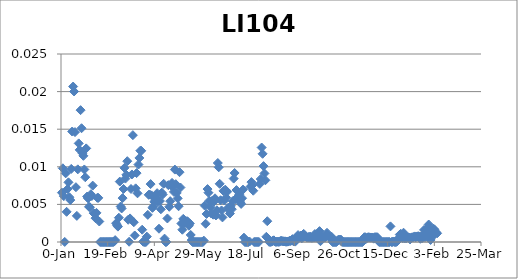
| Category |  LI104  |
|---|---|
| 0 | 0.007 |
| 1 | 0.01 |
| 2 | 0.006 |
| 3 | 0 |
| 4 | 0.009 |
| 5 | 0.004 |
| 6 | 0.007 |
| 7 | 0.008 |
| 8 | 0.006 |
| 9 | 0.006 |
| 10 | 0.01 |
| 11 | 0.015 |
| 12 | 0.021 |
| 13 | 0.02 |
| 14 | 0.015 |
| 15 | 0.007 |
| 16 | 0.003 |
| 17 | 0.01 |
| 18 | 0.013 |
| 19 | 0.012 |
| 20 | 0.018 |
| 21 | 0.015 |
| 22 | 0.012 |
| 23 | 0.011 |
| 24 | 0.01 |
| 25 | 0.009 |
| 26 | 0.012 |
| 27 | 0.006 |
| 28 | 0.006 |
| 29 | 0.005 |
| 30 | 0.005 |
| 31 | 0.006 |
| 32 | 0.006 |
| 33 | 0.007 |
| 34 | 0.004 |
| 35 | 0.004 |
| 36 | 0.003 |
| 37 | 0.004 |
| 38 | 0.006 |
| 39 | 0.006 |
| 40 | 0.003 |
| 41 | 0 |
| 42 | 0 |
| 43 | 0 |
| 44 | 0 |
| 45 | 0 |
| 46 | 0 |
| 47 | 0 |
| 48 | 0 |
| 49 | 0 |
| 50 | 0 |
| 51 | 0 |
| 52 | 0 |
| 53 | 0 |
| 54 | 0 |
| 55 | 0 |
| 56 | 0 |
| 57 | 0 |
| 58 | 0.002 |
| 59 | 0.002 |
| 60 | 0.002 |
| 61 | 0.003 |
| 62 | 0.008 |
| 63 | 0.005 |
| 64 | 0.004 |
| 65 | 0.006 |
| 66 | 0.007 |
| 67 | 0.01 |
| 68 | 0.008 |
| 69 | 0.009 |
| 70 | 0.011 |
| 71 | 0.003 |
| 72 | 0 |
| 73 | 0.003 |
| 74 | 0.007 |
| 75 | 0.009 |
| 76 | 0.014 |
| 77 | 0.003 |
| 78 | 0.001 |
| 79 | 0.007 |
| 80 | 0.009 |
| 81 | 0.006 |
| 82 | 0.01 |
| 83 | 0.011 |
| 84 | 0.012 |
| 85 | 0.012 |
| 86 | 0.002 |
| 87 | 0 |
| 88 | 0 |
| 89 | 0 |
| 90 | 0 |
| 91 | 0.001 |
| 92 | 0.004 |
| 93 | 0.006 |
| 94 | 0.006 |
| 95 | 0.008 |
| 96 | 0.006 |
| 97 | 0.005 |
| 98 | 0.005 |
| 99 | 0.005 |
| 100 | 0.006 |
| 101 | 0.006 |
| 102 | 0.006 |
| 103 | 0.005 |
| 104 | 0.002 |
| 105 | 0.005 |
| 106 | 0.004 |
| 107 | 0.007 |
| 108 | 0.006 |
| 109 | 0.008 |
| 110 | 0 |
| 111 | 0 |
| 112 | 0 |
| 113 | 0.003 |
| 114 | 0.008 |
| 115 | 0.005 |
| 116 | 0.005 |
| 117 | 0.007 |
| 118 | 0.008 |
| 119 | 0.007 |
| 120 | 0.007 |
| 121 | 0.01 |
| 122 | 0.008 |
| 123 | 0.007 |
| 124 | 0.006 |
| 125 | 0.005 |
| 126 | 0.009 |
| 127 | 0.007 |
| 128 | 0.002 |
| 129 | 0.002 |
| 130 | 0.003 |
| 131 | 0.003 |
| 132 | 0.003 |
| 133 | 0.003 |
| 134 | 0.003 |
| 135 | 0.003 |
| 136 | 0.002 |
| 137 | 0.002 |
| 138 | 0.001 |
| 139 | 0 |
| 140 | 0 |
| 141 | 0 |
| 142 | 0 |
| 143 | 0 |
| 144 | 0 |
| 145 | 0 |
| 146 | 0 |
| 147 | 0 |
| 148 | 0 |
| 149 | 0 |
| 150 | 0 |
| 151 | 0 |
| 152 | 0 |
| 153 | 0.005 |
| 154 | 0.002 |
| 155 | 0.004 |
| 156 | 0.007 |
| 157 | 0.007 |
| 158 | 0.005 |
| 159 | 0.005 |
| 160 | 0.004 |
| 161 | 0.005 |
| 162 | 0.004 |
| 163 | 0.005 |
| 164 | 0.006 |
| 165 | 0.004 |
| 166 | 0.004 |
| 167 | 0.011 |
| 168 | 0.01 |
| 169 | 0.008 |
| 170 | 0.006 |
| 171 | 0.004 |
| 172 | 0.003 |
| 173 | 0.007 |
| 174 | 0.006 |
| 175 | 0.007 |
| 176 | 0.006 |
| 177 | 0.007 |
| 178 | 0.005 |
| 179 | 0.004 |
| 180 | 0.004 |
| 181 | 0.005 |
| 182 | 0.004 |
| 183 | 0.005 |
| 184 | 0.008 |
| 185 | 0.009 |
| 186 | 0.006 |
| 187 | 0.007 |
| 188 | 0.006 |
| 189 | 0.006 |
| 190 | 0.006 |
| 191 | 0.005 |
| 192 | 0.005 |
| 193 | 0.006 |
| 194 | 0.007 |
| 195 | 0.001 |
| 196 | 0 |
| 197 | 0 |
| 198 | 0 |
| 199 | 0 |
| 200 | 0 |
| 201 | 0 |
| 202 | 0.007 |
| 203 | 0.008 |
| 204 | 0.008 |
| 205 | 0.007 |
| 206 | 0 |
| 207 | 0 |
| 208 | 0 |
| 209 | 0 |
| 210 | 0 |
| 211 | 0 |
| 212 | 0.008 |
| 213 | 0.008 |
| 214 | 0.013 |
| 215 | 0.012 |
| 216 | 0.01 |
| 217 | 0.009 |
| 218 | 0.008 |
| 219 | 0.001 |
| 220 | 0.003 |
| 221 | 0 |
| 222 | 0 |
| 223 | 0 |
| 224 | 0 |
| 225 | 0 |
| 226 | 0 |
| 227 | 0 |
| 228 | 0 |
| 229 | 0 |
| 230 | 0 |
| 231 | 0 |
| 232 | 0 |
| 233 | 0 |
| 234 | 0 |
| 235 | 0 |
| 236 | 0 |
| 237 | 0 |
| 238 | 0 |
| 239 | 0 |
| 240 | 0 |
| 241 | 0 |
| 242 | 0 |
| 243 | 0 |
| 244 | 0 |
| 245 | 0 |
| 246 | 0 |
| 247 | 0 |
| 248 | 0 |
| 249 | 0 |
| 250 | 0 |
| 251 | 0 |
| 252 | 0.001 |
| 253 | 0.001 |
| 254 | 0.001 |
| 255 | 0.001 |
| 256 | 0.001 |
| 257 | 0 |
| 258 | 0.001 |
| 259 | 0.001 |
| 260 | 0.001 |
| 261 | 0.001 |
| 262 | 0.001 |
| 263 | 0.001 |
| 264 | 0.001 |
| 265 | 0.001 |
| 266 | 0.001 |
| 267 | 0.001 |
| 268 | 0.001 |
| 269 | 0.001 |
| 270 | 0.001 |
| 271 | 0.001 |
| 272 | 0.001 |
| 273 | 0.001 |
| 274 | 0.001 |
| 275 | 0.001 |
| 276 | 0.001 |
| 277 | 0 |
| 278 | 0 |
| 279 | 0.001 |
| 280 | 0.001 |
| 281 | 0.001 |
| 282 | 0.001 |
| 283 | 0.001 |
| 284 | 0.001 |
| 285 | 0.001 |
| 286 | 0.001 |
| 287 | 0.001 |
| 288 | 0.001 |
| 289 | 0.001 |
| 290 | 0 |
| 291 | 0 |
| 292 | 0 |
| 293 | 0 |
| 294 | 0 |
| 295 | 0 |
| 296 | 0 |
| 297 | 0 |
| 298 | 0 |
| 299 | 0 |
| 300 | 0 |
| 301 | 0 |
| 302 | 0 |
| 303 | 0 |
| 304 | 0 |
| 305 | 0 |
| 306 | 0 |
| 307 | 0 |
| 308 | 0 |
| 309 | 0 |
| 310 | 0 |
| 311 | 0 |
| 312 | 0 |
| 313 | 0 |
| 314 | 0 |
| 315 | 0 |
| 316 | 0 |
| 317 | 0 |
| 318 | 0 |
| 319 | 0 |
| 320 | 0 |
| 321 | 0 |
| 322 | 0 |
| 323 | 0 |
| 324 | 0.001 |
| 325 | 0.001 |
| 326 | 0 |
| 327 | 0.001 |
| 328 | 0.001 |
| 329 | 0.001 |
| 330 | 0.001 |
| 331 | 0.001 |
| 332 | 0.001 |
| 333 | 0.001 |
| 334 | 0 |
| 335 | 0.001 |
| 336 | 0.001 |
| 337 | 0.001 |
| 338 | 0.001 |
| 339 | 0 |
| 340 | 0 |
| 341 | 0 |
| 342 | 0 |
| 343 | 0 |
| 344 | 0 |
| 345 | 0 |
| 346 | 0 |
| 347 | 0 |
| 348 | 0 |
| 349 | 0 |
| 350 | 0 |
| 351 | 0 |
| 352 | 0.002 |
| 353 | 0 |
| 354 | 0 |
| 355 | 0 |
| 356 | 0 |
| 357 | 0 |
| 358 | 0 |
| 359 | 0 |
| 360 | 0 |
| 361 | 0.001 |
| 362 | 0.001 |
| 363 | 0.001 |
| 364 | 0.001 |
| 365 | 0.001 |
| 366 | 0.001 |
| 367 | 0 |
| 368 | 0.001 |
| 369 | 0 |
| 370 | 0.001 |
| 371 | 0.001 |
| 372 | 0.001 |
| 373 | 0 |
| 374 | 0.001 |
| 375 | 0.001 |
| 376 | 0.001 |
| 377 | 0.001 |
| 378 | 0.001 |
| 379 | 0.001 |
| 380 | 0.001 |
| 381 | 0.001 |
| 382 | 0.001 |
| 383 | 0.001 |
| 384 | 0 |
| 385 | 0.001 |
| 386 | 0.001 |
| 387 | 0.001 |
| 388 | 0.002 |
| 389 | 0.001 |
| 390 | 0.001 |
| 391 | 0.001 |
| 392 | 0.002 |
| 393 | 0.002 |
| 394 | 0.001 |
| 395 | 0 |
| 396 | 0.001 |
| 397 | 0.001 |
| 398 | 0.002 |
| 399 | 0.002 |
| 400 | 0.001 |
| 401 | 0.001 |
| 402 | 0.001 |